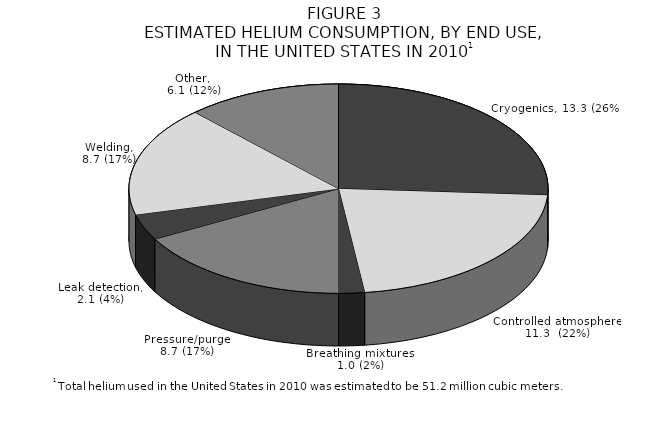
| Category | Series 0 |
|---|---|
| Cryogenics | 13.31 |
| Controlled atmosphere | 11.26 |
| Breathing mixtures | 1.02 |
| Pressure/purge | 8.7 |
| Leak detection | 2.05 |
| Welding | 8.7 |
| Other | 6.14 |